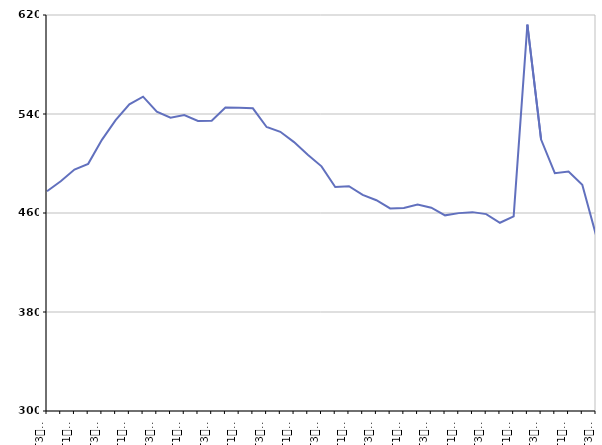
| Category | Moins de 25 ans |
|---|---|
| T3
2011 | 477.6 |
| T4
2011 | 485.7 |
| T1
2012 | 495.1 |
| T2
2012 | 499.7 |
| T3
2012 | 519.1 |
| T4
2012 | 535.1 |
| T1
2013 | 547.8 |
| T2
2013 | 554 |
| T3
2013 | 541.9 |
| T4
2013 | 537 |
| T1
2014 | 539.2 |
| T2
2014 | 534.4 |
| T3
2014 | 534.5 |
| T4
2014 | 545.2 |
| T1
2015 | 545.1 |
| T2
2015 | 544.6 |
| T3
2015 | 529.5 |
| T4
2015 | 525.6 |
| T1
2016 | 517.3 |
| T2
2016 | 507.1 |
| T3
2016 | 497.7 |
| T4
2016 | 481 |
| T1
2017 | 481.7 |
| T2
2017 | 474.6 |
| T3
2017 | 470.3 |
| T4
2017 | 463.7 |
| T1
2018 | 464.1 |
| T2
2018 | 466.9 |
| T3
2018 | 464.3 |
| T4
2018 | 458.1 |
| T1
2019 | 459.9 |
| T2
2019 | 460.7 |
| T3
2019 | 459.1 |
| T4
2019 | 452.1 |
| T1
2020 | 457.3 |
| T2
2020 | 612.2 |
| T3
2020 | 519.3 |
| T4
2020 | 492.2 |
| T1
2021 | 493.5 |
| T2
2021 | 482.9 |
| T3
2021 | 442.2 |